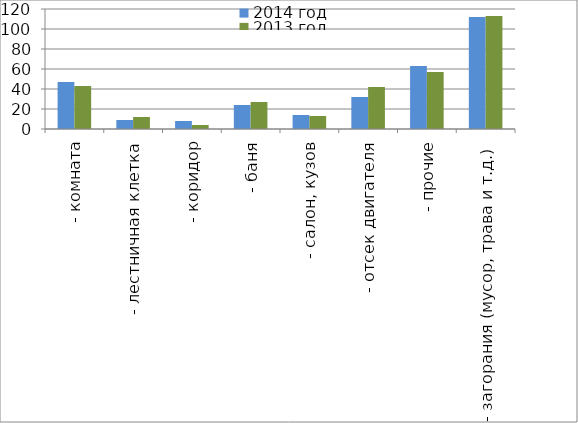
| Category | 2014 год | 2013 год |
|---|---|---|
|  - комната | 47 | 43 |
|  - лестничная клетка | 9 | 12 |
|  - коридор | 8 | 4 |
|  - баня | 24 | 27 |
|  - салон, кузов | 14 | 13 |
|  - отсек двигателя | 32 | 42 |
| - прочие | 63 | 57 |
| - загорания (мусор, трава и т.д.)  | 112 | 113 |